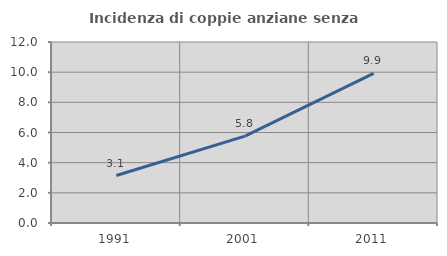
| Category | Incidenza di coppie anziane senza figli  |
|---|---|
| 1991.0 | 3.147 |
| 2001.0 | 5.763 |
| 2011.0 | 9.923 |